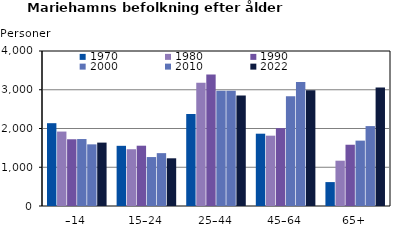
| Category | 1970 | 1980 | 1990 | 2000 | 2010 | 2022 |
|---|---|---|---|---|---|---|
| –14 | 2137 | 1921 | 1722 | 1728 | 1591 | 1636 |
| 15–24 | 1553 | 1465 | 1556 | 1263 | 1364 | 1231 |
| 25–44 | 2373 | 3183 | 3395 | 2977 | 2975 | 2851 |
| 45–64 | 1866 | 1815 | 2009 | 2833 | 3198 | 2984 |
| 65+ | 617 | 1169 | 1581 | 1687 | 2062 | 3055 |